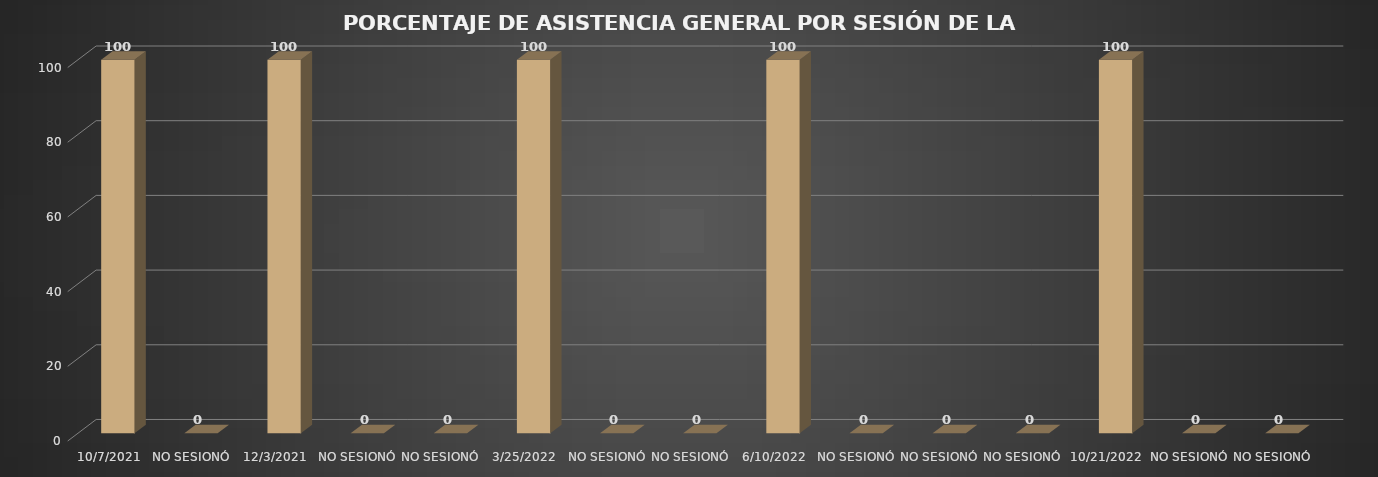
| Category | Series 0 |
|---|---|
| 07/10/2021 | 100 |
| NO SESIONÓ | 0 |
| 03/12/2021 | 100 |
| NO SESIONÓ | 0 |
| NO SESIONÓ | 0 |
| 25/03/2022 | 100 |
| NO SESIONÓ | 0 |
| NO SESIONÓ | 0 |
| 10/06/2022 | 100 |
| NO SESIONÓ | 0 |
| NO SESIONÓ | 0 |
| NO SESIONÓ | 0 |
| 21/10/2022 | 100 |
| NO SESIONÓ | 0 |
| NO SESIONÓ | 0 |